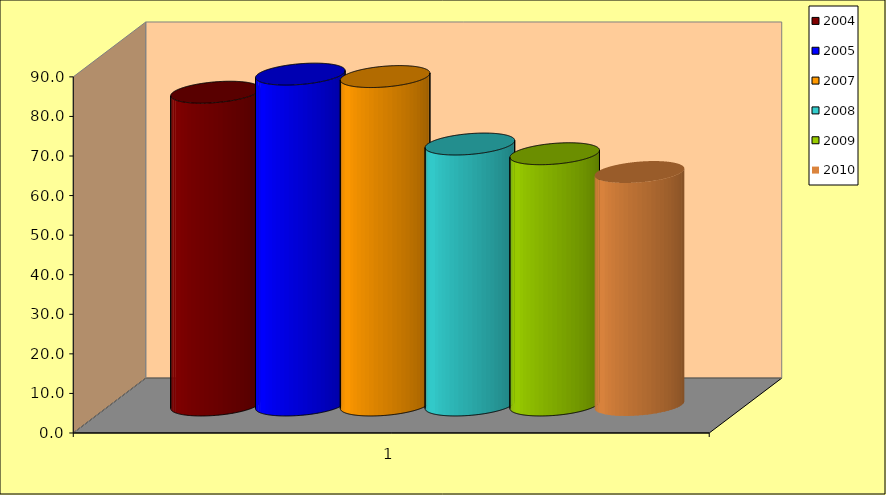
| Category | 2004 | 2005 | 2007 | 2008 | 2009 | 2010 |
|---|---|---|---|---|---|---|
| 0 | 79.043 | 83.621 | 83 | 65.95 | 63.5 | 58.879 |